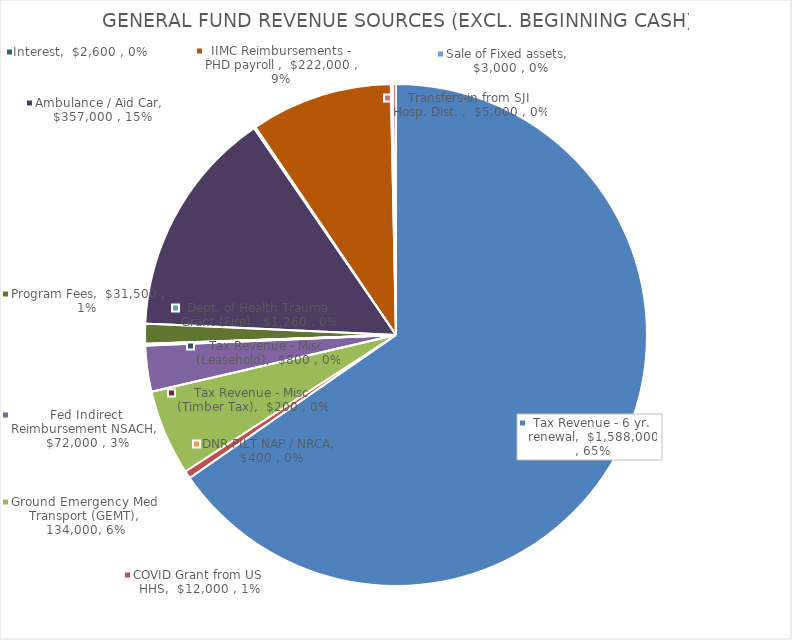
| Category | Series 0 |
|---|---|
| Tax Revenue - 6 yr. renewal | 1588000 |
| COVID Grant from US HHS | 12000 |
| Ground Emergency Med Transport (GEMT) | 134000 |
| Fed Indirect Reimbursement NSACH | 72000 |
| Dept. of Health Trauma Grant (Fire) | 1260 |
| DNR PILT NAP / NRCA | 400 |
| Tax Revenue - Misc (Leasehold) | 800 |
| Tax Revenue - Misc (Timber Tax) | 200 |
| Program Fees | 31500 |
| Ambulance / Aid Car | 357000 |
| Interest | 2600 |
| IIMC Reimbursements - PHD payroll  | 222000 |
| Sale of Fixed assets | 3000 |
| Transfers-in from SJI Hosp. Dist.  | 5000 |